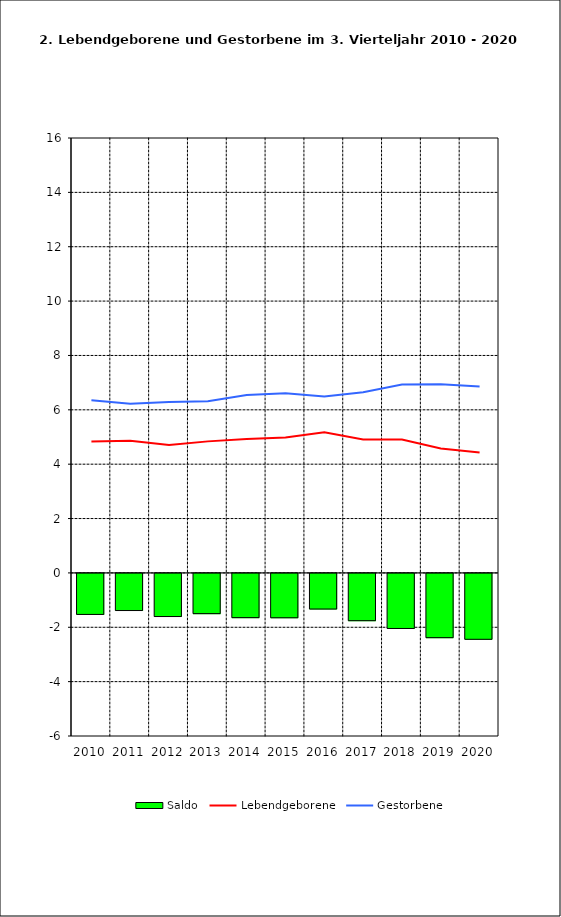
| Category | Saldo |
|---|---|
| 2010.0 | -1.509 |
| 2011.0 | -1.366 |
| 2012.0 | -1.587 |
| 2013.0 | -1.48 |
| 2014.0 | -1.627 |
| 2015.0 | -1.632 |
| 2016.0 | -1.311 |
| 2017.0 | -1.739 |
| 2018.0 | -2.026 |
| 2019.0 | -2.364 |
| 2020.0 | -2.424 |